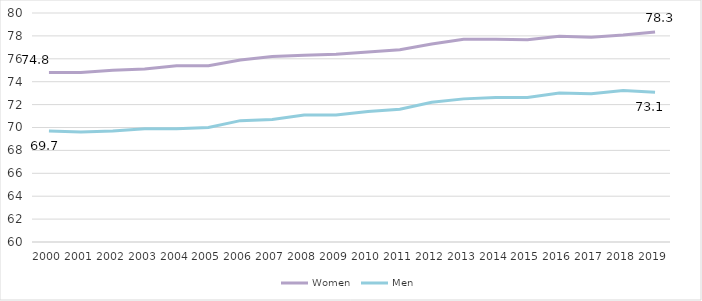
| Category | Women | Men |
|---|---|---|
| 2000.0 | 74.8 | 69.7 |
| 2001.0 | 74.8 | 69.6 |
| 2002.0 | 75 | 69.7 |
| 2003.0 | 75.1 | 69.9 |
| 2004.0 | 75.4 | 69.9 |
| 2005.0 | 75.4 | 70 |
| 2006.0 | 75.9 | 70.6 |
| 2007.0 | 76.2 | 70.7 |
| 2008.0 | 76.3 | 71.1 |
| 2009.0 | 76.4 | 71.1 |
| 2010.0 | 76.6 | 71.4 |
| 2011.0 | 76.8 | 71.6 |
| 2012.0 | 77.3 | 72.2 |
| 2013.0 | 77.7 | 72.5 |
| 2014.0 | 77.697 | 72.612 |
| 2015.0 | 77.674 | 72.625 |
| 2016.0 | 77.978 | 73.005 |
| 2017.0 | 77.876 | 72.95 |
| 2018.0 | 78.079 | 73.222 |
| 2019.0 | 78.347 | 73.087 |